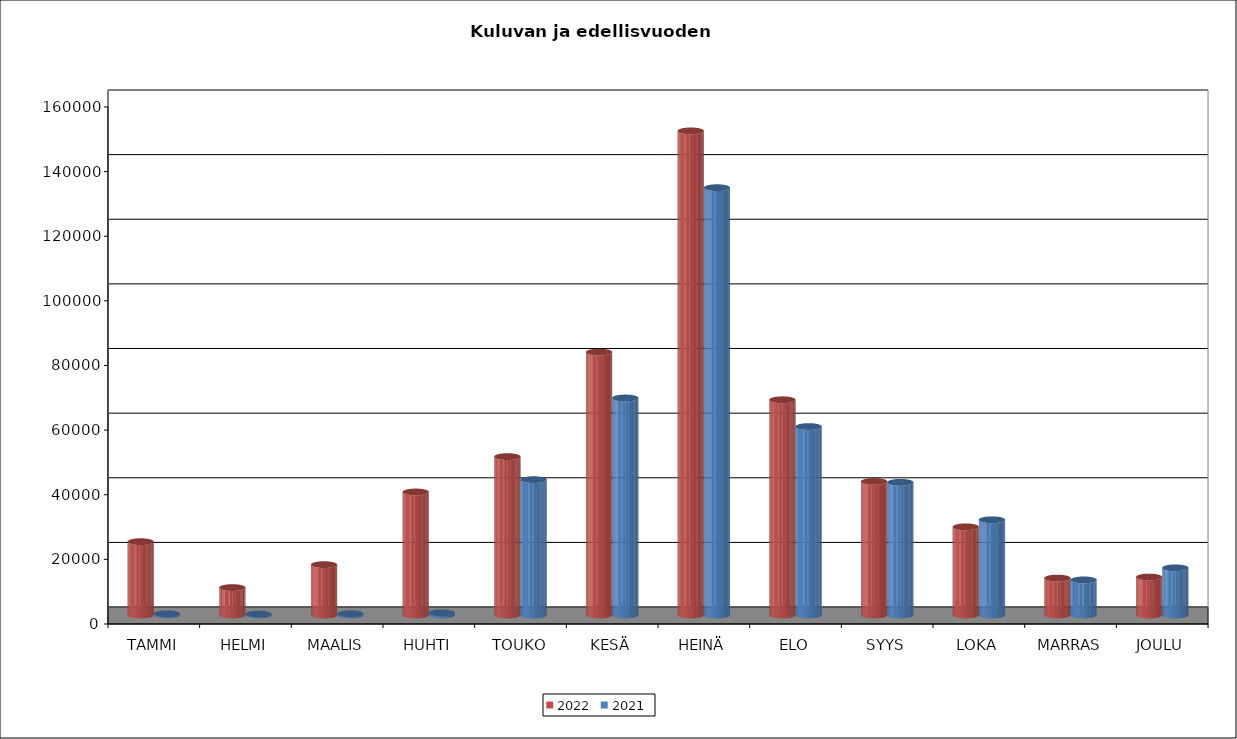
| Category | 2022 | 2021 |
|---|---|---|
| TAMMI | 22695 | 367 |
| HELMI | 8485 | 281 |
| MAALIS | 15581 | 410 |
| HUHTI | 38072 | 656 |
| TOUKO | 49014 | 41880 |
| KESÄ | 81354 | 67157 |
| HEINÄ | 149810 | 132229 |
| ELO | 66606 | 58316 |
| SYYS | 41331 | 41060 |
| LOKA | 27291 | 29470 |
| MARRAS | 11436 | 10864 |
| JOULU | 11752 | 14596 |